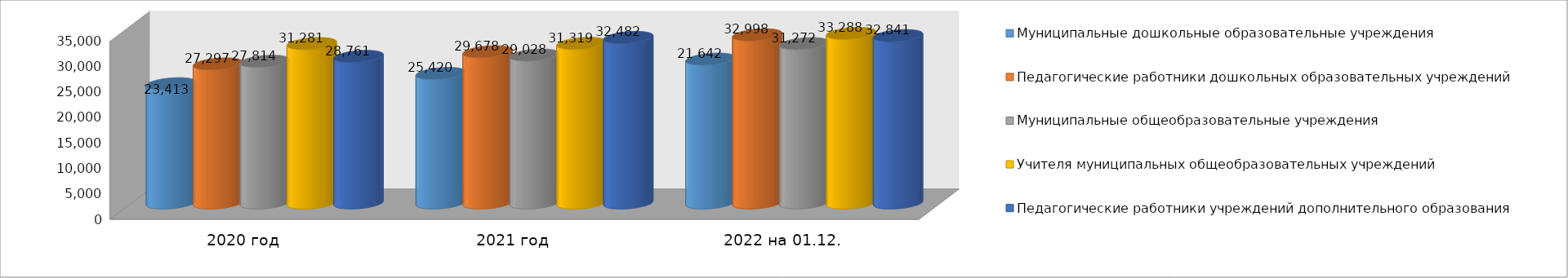
| Category | Муниципальные дошкольные образовательные учреждения | Педагогические работники дошкольных образовательных учреждений | Муниципальные общеобразовательные учреждения | Учителя муниципальных общеобразовательных учреждений | Педагогические работники учреждений дополнительного образования |
|---|---|---|---|---|---|
| 2020 год | 23413 | 27297 | 27814 | 31281 | 28761 |
| 2021 год | 25420 | 29678 | 29028 | 31319 | 32482 |
| 2022 на 01.12. | 28233 | 32998 | 31272 | 33288 | 32841 |